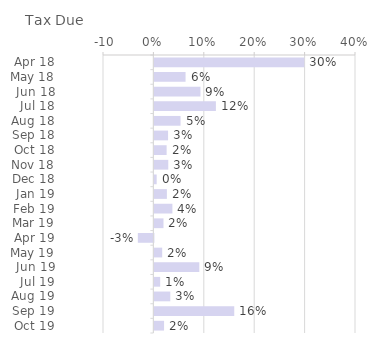
| Category | Tax Due |
|---|---|
| Apr 18 | 0.297 |
| May 18 | 0.062 |
| Jun 18 | 0.091 |
| Jul 18 | 0.122 |
| Aug 18 | 0.052 |
| Sep 18 | 0.027 |
| Oct 18 | 0.024 |
| Nov 18 | 0.027 |
| Dec 18 | 0.005 |
| Jan 19 | 0.025 |
| Feb 19 | 0.036 |
| Mar 19 | 0.018 |
| Apr 19 | -0.031 |
| May 19 | 0.015 |
| Jun 19 | 0.089 |
| Jul 19 | 0.011 |
| Aug 19 | 0.031 |
| Sep 19 | 0.158 |
| Oct 19 | 0.019 |